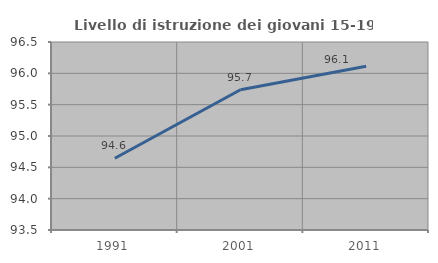
| Category | Livello di istruzione dei giovani 15-19 anni |
|---|---|
| 1991.0 | 94.646 |
| 2001.0 | 95.738 |
| 2011.0 | 96.113 |